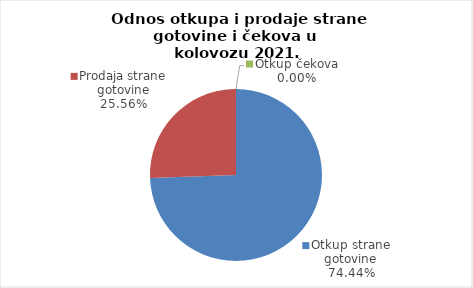
| Category | Series 0 |
|---|---|
| Otkup strane gotovine | 74.438 |
| Prodaja strane gotovine | 25.562 |
| Otkup čekova | 0 |